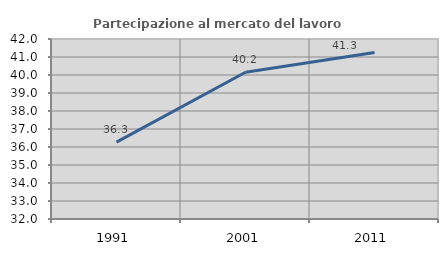
| Category | Partecipazione al mercato del lavoro  femminile |
|---|---|
| 1991.0 | 36.271 |
| 2001.0 | 40.153 |
| 2011.0 | 41.253 |